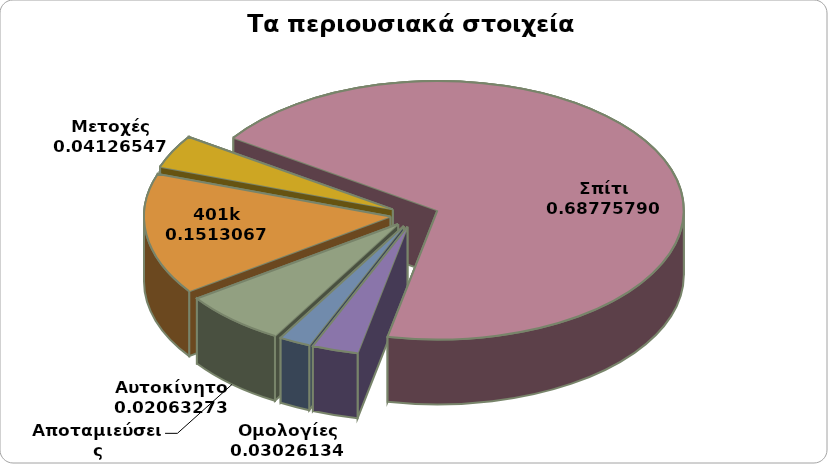
| Category | Ποσό |
|---|---|
| Αποταμιεύσεις | 25000 |
| 401k | 55000 |
| Μετοχές | 15000 |
| Σπίτι | 250000 |
| Ομολογίες | 11000 |
| Αυτοκίνητο | 7500 |